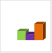
| Category | област Пловдив |
|---|---|
| летен сезон 2019  | 459275 |
| летен сезон 2021  | 438727 |
| летен сезон 2022 г.  | 504156 |